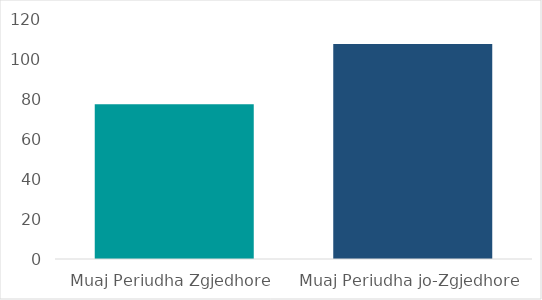
| Category | Mesatarisht Pagesa për Muaj |
|---|---|
| Muaj Periudha Zgjedhore | 77.421 |
| Muaj Periudha jo-Zgjedhore | 107.494 |